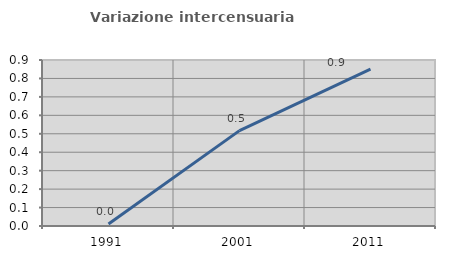
| Category | Variazione intercensuaria annua |
|---|---|
| 1991.0 | 0.011 |
| 2001.0 | 0.517 |
| 2011.0 | 0.85 |